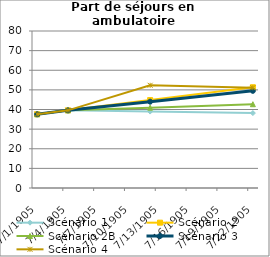
| Category | Scénario 1 | Scénario 2 | Scénario 2B | Scénario 3 | Scénario 4 |
|---|---|---|---|---|---|
| 2009.0 | 37.569 | 37.569 | 37.569 | 37.569 | 37.569 |
| 2012.0 | 39.565 | 39.565 | 39.565 | 39.565 | 39.565 |
| 2020.0 | 38.947 | 44.798 | 40.954 | 43.984 | 52.339 |
| 2030.0 | 38.174 | 51.339 | 42.689 | 49.507 | 51.101 |